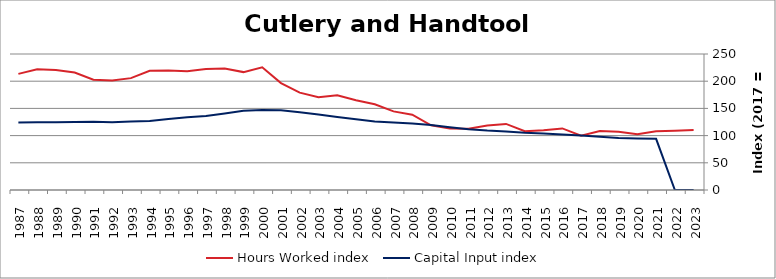
| Category | Hours Worked index | Capital Input index |
|---|---|---|
| 2023.0 | 110.137 | 0 |
| 2022.0 | 108.718 | 0 |
| 2021.0 | 108.057 | 94.068 |
| 2020.0 | 102.465 | 94.578 |
| 2019.0 | 106.938 | 95.686 |
| 2018.0 | 108.265 | 97.661 |
| 2017.0 | 100 | 100 |
| 2016.0 | 113.178 | 102.204 |
| 2015.0 | 109.932 | 103.737 |
| 2014.0 | 108.171 | 105.217 |
| 2013.0 | 121.46 | 107.723 |
| 2012.0 | 118.761 | 109.255 |
| 2011.0 | 112.618 | 111.815 |
| 2010.0 | 113.25 | 115.295 |
| 2009.0 | 118.872 | 119.364 |
| 2008.0 | 138.415 | 122.296 |
| 2007.0 | 144.531 | 124.198 |
| 2006.0 | 157.73 | 126.095 |
| 2005.0 | 165.14 | 130.179 |
| 2004.0 | 173.948 | 134.173 |
| 2003.0 | 170.517 | 138.866 |
| 2002.0 | 179.052 | 142.972 |
| 2001.0 | 196.511 | 146.449 |
| 2000.0 | 225.658 | 146.858 |
| 1999.0 | 216.727 | 145.673 |
| 1998.0 | 223.431 | 140.731 |
| 1997.0 | 222.204 | 136.138 |
| 1996.0 | 218.472 | 133.711 |
| 1995.0 | 219.666 | 130.391 |
| 1994.0 | 219.194 | 126.937 |
| 1993.0 | 205.651 | 125.771 |
| 1992.0 | 201.128 | 124.577 |
| 1991.0 | 202.846 | 125.5 |
| 1990.0 | 215.89 | 125.165 |
| 1989.0 | 220.785 | 124.576 |
| 1988.0 | 221.966 | 124.662 |
| 1987.0 | 213.47 | 124.166 |